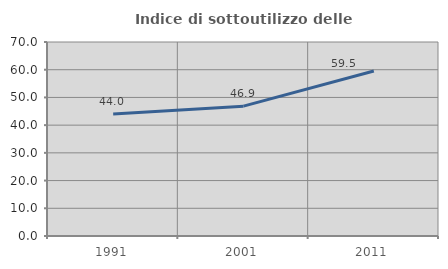
| Category | Indice di sottoutilizzo delle abitazioni  |
|---|---|
| 1991.0 | 43.979 |
| 2001.0 | 46.86 |
| 2011.0 | 59.545 |